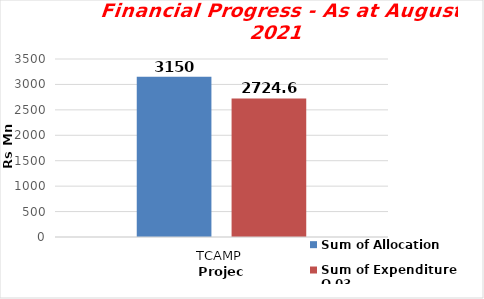
| Category | Sum of Allocation  | Sum of Expenditure Q 03 |
|---|---|---|
| TCAMP | 3150 | 2724.6 |